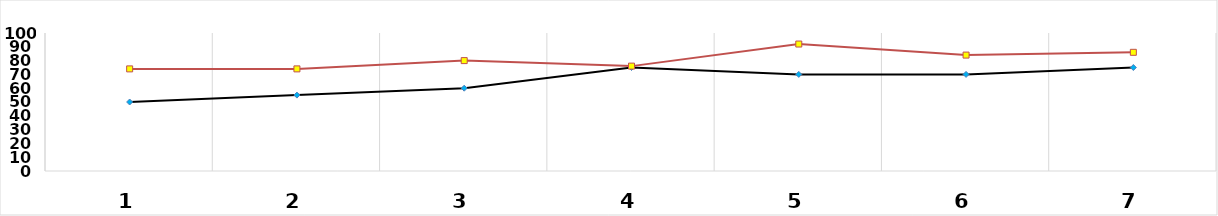
| Category | Series 0 | Series 1 |
|---|---|---|
| 1.0 | 50 | 74 |
| 2.0 | 55 | 74 |
| 3.0 | 60 | 80 |
| 4.0 | 75 | 76 |
| 5.0 | 70 | 92 |
| 6.0 | 70 | 84 |
| 7.0 | 75 | 86 |